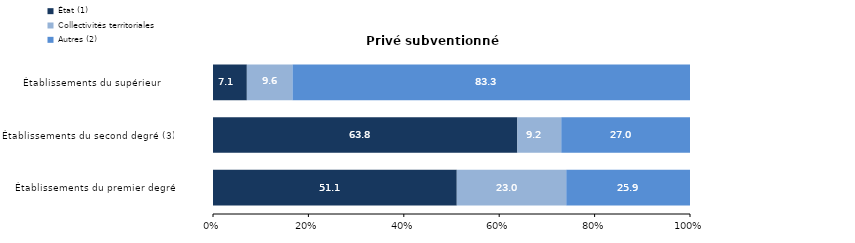
| Category | État (1) | Collectivités territoriales | Autres (2) |
|---|---|---|---|
| Établissements du premier degré | 51.107 | 22.953 | 25.94 |
| Établissements du second degré (3) | 63.808 | 9.202 | 26.99 |
| Établissements du supérieur      | 7.095 | 9.577 | 83.328 |